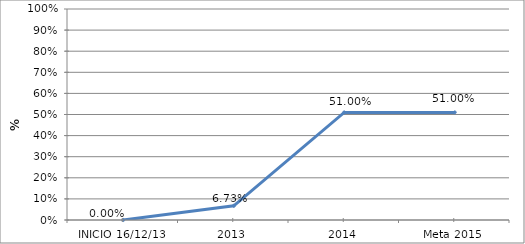
| Category | Series 0 |
|---|---|
| INICIO 16/12/13 | 0 |
| 2013 | 0.067 |
| 2014 | 0.51 |
| Meta 2015 | 0.51 |